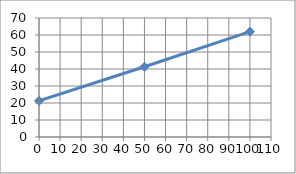
| Category | Series 0 |
|---|---|
| 100.0 | 61.97 |
| 50.0 | 41.33 |
| 0.0 | 21.21 |